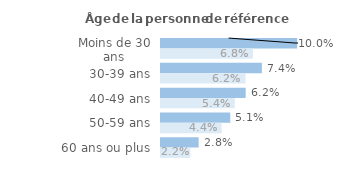
| Category | Series 1 | Series 0 |
|---|---|---|
| Moins de 30 ans | 0.1 | 0.068 |
| 30-39 ans | 0.074 | 0.062 |
| 40-49 ans | 0.062 | 0.054 |
| 50-59 ans | 0.051 | 0.044 |
| 60 ans ou plus | 0.028 | 0.022 |